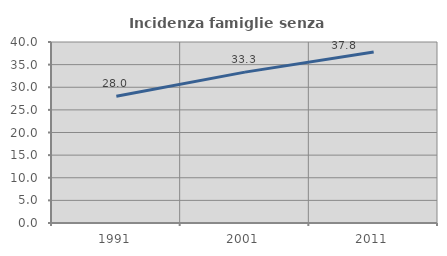
| Category | Incidenza famiglie senza nuclei |
|---|---|
| 1991.0 | 28.012 |
| 2001.0 | 33.344 |
| 2011.0 | 37.768 |